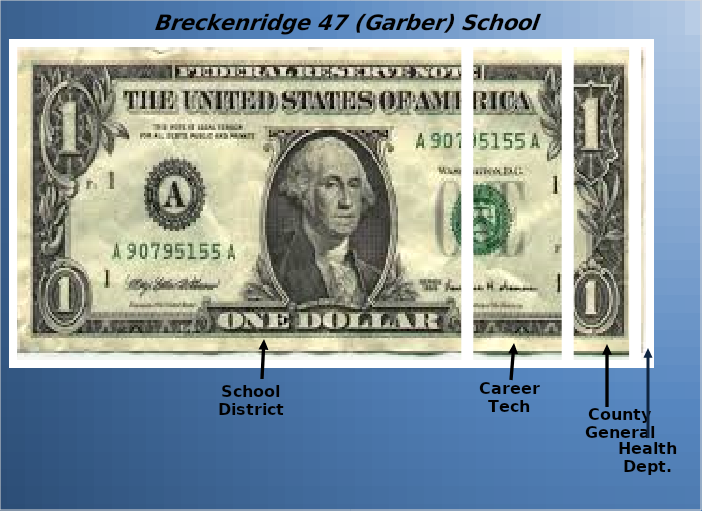
| Category | School District | Career Tech | County General | Health Dept. |
|---|---|---|---|---|
| 0 | 0.712 | 0.157 | 0.105 | 0.026 |